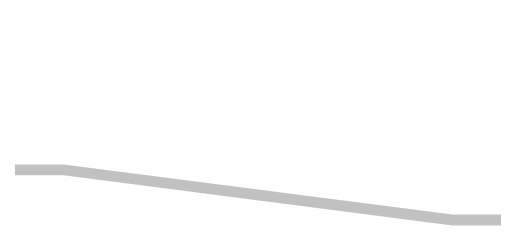
| Category | S1 | S2 | S3 |
|---|---|---|---|
| 0.0 | 1300 | 100 | 530 |
| 10.0 | 1300 | 100 | 530 |
| 90.0 | 1760 | 100 | 70 |
| 100.0 | 1760 | 100 | 70 |